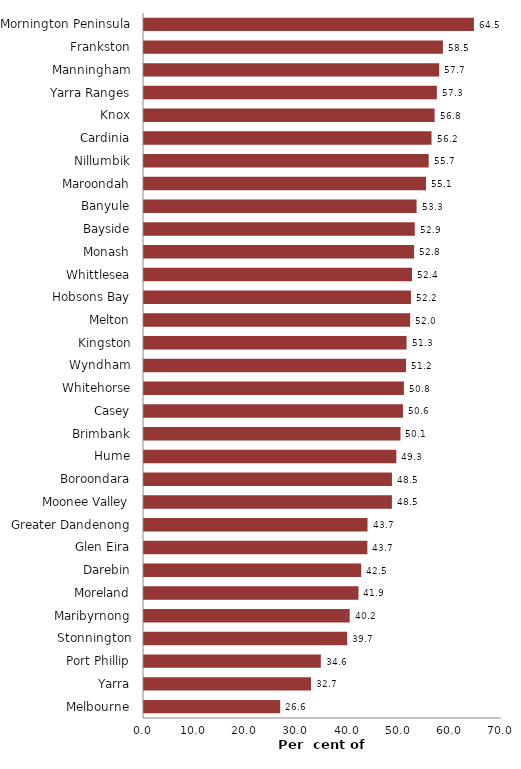
| Category | Series 0 |
|---|---|
| Melbourne | 26.633 |
| Yarra | 32.66 |
| Port Phillip | 34.575 |
| Stonnington | 39.728 |
| Maribyrnong | 40.217 |
| Moreland | 41.936 |
| Darebin | 42.471 |
| Glen Eira | 43.672 |
| Greater Dandenong | 43.705 |
| Moonee Valley | 48.476 |
| Boroondara | 48.483 |
| Hume | 49.34 |
| Brimbank | 50.15 |
| Casey | 50.638 |
| Whitehorse | 50.823 |
| Wyndham | 51.235 |
| Kingston | 51.341 |
| Melton | 52.042 |
| Hobsons Bay | 52.196 |
| Whittlesea | 52.399 |
| Monash | 52.816 |
| Bayside | 52.94 |
| Banyule | 53.3 |
| Maroondah | 55.148 |
| Nillumbik | 55.663 |
| Cardinia | 56.219 |
| Knox | 56.823 |
| Yarra Ranges | 57.264 |
| Manningham | 57.721 |
| Frankston | 58.451 |
| Mornington Peninsula | 64.511 |